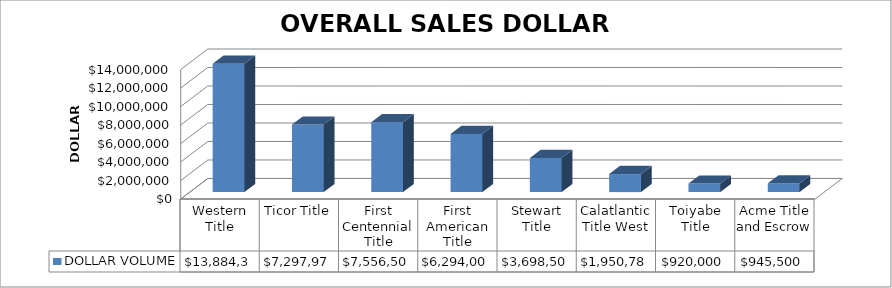
| Category | DOLLAR VOLUME |
|---|---|
| Western Title | 13884316 |
| Ticor Title | 7297973 |
| First Centennial Title | 7556500 |
| First American Title | 6294000 |
| Stewart Title | 3698500 |
| Calatlantic Title West | 1950783 |
| Toiyabe Title | 920000 |
| Acme Title and Escrow | 945500 |